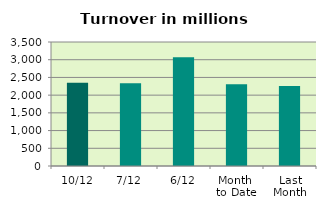
| Category | Series 0 |
|---|---|
| 10/12 | 2349.685 |
| 7/12 | 2336.289 |
| 6/12 | 3067.039 |
| Month 
to Date | 2304.745 |
| Last
Month | 2254.707 |